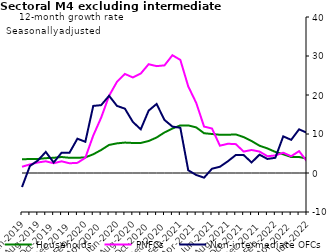
| Category | zero | Households | PNFCs | Non-intermediate OFCs |
|---|---|---|---|---|
| Jun-2019 | 0 | 3.5 | 1.6 | -3.6 |
| Jul-2019 | 0 | 3.6 | 2.2 | 1.8 |
| Aug-2019 | 0 | 3.6 | 2.7 | 3.2 |
| Sep-2019 | 0 | 3.8 | 3 | 5.4 |
| Oct-2019 | 0 | 3.9 | 2.5 | 2.7 |
| Nov-2019 | 0 | 4.1 | 3 | 5.2 |
| Dec-2019 | 0 | 3.9 | 2.5 | 5.2 |
| Jan-2020 | 0 | 3.9 | 2.6 | 8.8 |
| Feb-2020 | 0 | 4 | 3.9 | 8 |
| Mar-2020 | 0 | 4.8 | 9.6 | 17.2 |
| Apr-2020 | 0 | 5.9 | 14.2 | 17.4 |
| May-2020 | 0 | 7.2 | 19.8 | 19.8 |
| Jun-2020 | 0 | 7.6 | 23.4 | 17.2 |
| Jul-2020 | 0 | 7.8 | 25.4 | 16.5 |
| Aug-2020 | 0 | 7.7 | 24.5 | 13.1 |
| Sep-2020 | 0 | 7.7 | 25.5 | 11.2 |
| Oct-2020 | 0 | 8.2 | 27.9 | 16 |
| Nov-2020 | 0 | 9.1 | 27.4 | 17.7 |
| Dec-2020 | 0 | 10.4 | 27.6 | 13.6 |
| Jan-2021 | 0 | 11.4 | 30.2 | 11.9 |
| Feb-2021 | 0 | 12.2 | 29 | 11.6 |
| Mar-2021 | 0 | 12.2 | 22.2 | 0.7 |
| Apr-2021 | 0 | 11.7 | 18 | -0.5 |
| May-2021 | 0 | 10.2 | 11.9 | -1.2 |
| Jun-2021 | 0 | 10 | 11.4 | 1.1 |
| Jul-2021 | 0 | 9.8 | 7 | 1.6 |
| Aug-2021 | 0 | 9.8 | 7.5 | 3 |
| Sep-2021 | 0 | 9.9 | 7.4 | 4.6 |
| Oct-2021 | 0 | 9.2 | 5.5 | 4.6 |
| Nov-2021 | 0 | 8.2 | 5.9 | 2.7 |
| Dec-2021 | 0 | 7 | 5.5 | 4.7 |
| Jan-2022 | 0 | 6.3 | 4.3 | 3.6 |
| Feb-2022 | 0 | 5.4 | 4.5 | 3.9 |
| Mar-2022 | 0 | 4.8 | 5.2 | 9.4 |
| Apr-2022 | 0 | 4.1 | 4.3 | 8.5 |
| May-2022 | 0 | 4.1 | 5.6 | 11.2 |
| Jun-2022 | 0 | 3.7 | 3 | 10.3 |